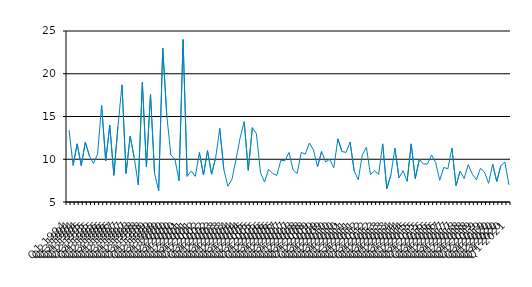
| Category | Series 0 |
|---|---|
| Q1 1994 | 13.4 |
| Q2 1994 | 9.28 |
| Q3 1994 | 11.8 |
| Q4 1994 | 9.26 |
| Q1 1995 | 12 |
| Q2 1995 | 10.4 |
| Q3 1995 | 9.5 |
| Q4 1995 | 10.6 |
| Q1 1996 | 16.3 |
| Q2 1996 | 9.8 |
| Q3 1996 | 14 |
| Q4 1996 | 8.12 |
| Q1 1997 | 13.8 |
| Q2 1997 | 18.7 |
| Q3 1997 | 8.33 |
| Q4 1997 | 12.7 |
| Q1 1998 | 10.2 |
| Q2 1998 | 7 |
| Q3 1998 | 19 |
| Q4 1998 | 9.11 |
| Q1 1999 | 17.6 |
| Q2 1999 | 8.33 |
| Q3 1999 | 6.33 |
| Q4 1999 | 23 |
| Q1 2000 | 15.1 |
| Q2 2000 | 10.5 |
| Q3 2000 | 10 |
| Q4 2000 | 7.5 |
| Q1 2001 | 24 |
| Q2 2001 | 8 |
| Q3 2001 | 8.62 |
| Q4 2001 | 8 |
| Q1 2002 | 10.8 |
| Q2 2002 | 8.16 |
| Q3 2002 | 11 |
| Q4 2002 | 8.25 |
| Q1 2003 | 10.2 |
| Q2 2003 | 13.6 |
| Q3 2003 | 8.8 |
| Q4 2003 | 6.83 |
| Q1 2004 | 7.66 |
| Q2 2004 | 10 |
| Q3 2004 | 12.5 |
| Q4 2004 | 14.4 |
| Q1 2005 | 8.71 |
| Q2 2005 | 13.7 |
| Q3 2005 | 13 |
| Q4 2005 | 8.44 |
| Q1 2006 | 7.33 |
| Q2 2006 | 8.83 |
| Q3 2006 | 8.33 |
| Q4 2006 | 8.11 |
| Q1 2007 | 9.88 |
| Q2 2007 | 9.82 |
| Q3 2007 | 10.8 |
| Q4 2007 | 8.75 |
| Q1 2008 | 8.33 |
| Q2 2008 | 10.8 |
| Q3 2008 | 10.6 |
| Q4 2008 | 11.9 |
| Q1 2009 | 11.1 |
| Q2 2009 | 9.13 |
| Q3 2009 | 10.9 |
| Q4 2009 | 9.69 |
| Q1 2010 | 10 |
| Q2 2010 | 9 |
| Q3 2010 | 12.4 |
| Q4 2010 | 10.9 |
| Q1 2011 | 10.8 |
| Q2 2011 | 12 |
| Q3 2011 | 8.64 |
| Q4 2011 | 7.6 |
| Q1 2012 | 10.5 |
| Q2 2012 | 11.4 |
| Q3 2012 | 8.2 |
| Q4 2012 | 8.65 |
| Q1 2013 | 8.24 |
| Q2 2013 | 11.8 |
| Q3 2013 | 6.55 |
| Q4 2013 | 8.14 |
| Q1 2014 | 11.3 |
| Q2 2014 | 7.83 |
| Q3 2014 | 8.67 |
| Q4 2014 | 7.42 |
| Q1 2015 | 11.8 |
| Q2 2015 | 7.74 |
| Q3 2015 | 10 |
| Q4 2015 | 9.44 |
| Q1 2016 | 9.45 |
| Q2 2016 | 10.5 |
| Q3 2016 | 9.62 |
| Q4 2016 | 7.54 |
| Q1 2017 | 9.04 |
| Q2 2017 | 8.89 |
| Q3 2017 | 11.3 |
| Q4 2017 | 6.91 |
| Q1 2018 | 8.6 |
| Q2 2018 | 7.74 |
| Q3 2018 | 9.38 |
| Q4 2018 | 8.26 |
| Q1 2019 | 7.6 |
| Q2 2019 | 8.941 |
| Q3 2019 | 8.5 |
| Q4 2019 | 7.19 |
| Q1 2020 | 9.41 |
| Q2 2020 | 7.4 |
| Q3 2020 | 9.25 |
| Q4 2020 | 9.67 |
| Q1 2021 | 7 |